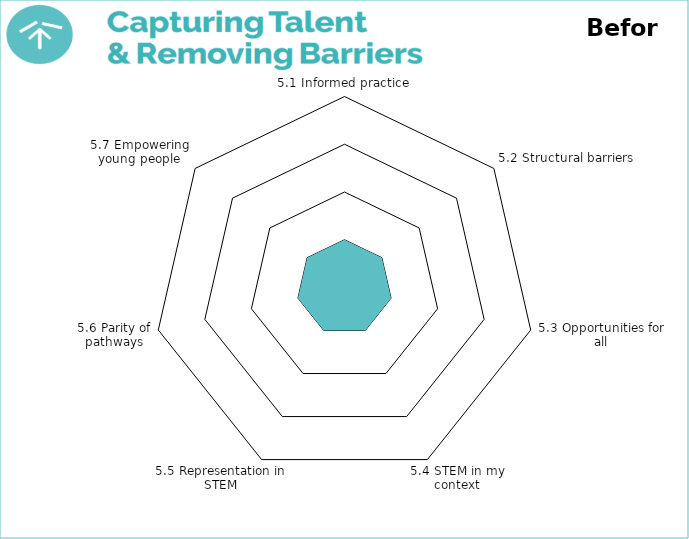
| Category | Theme 1: Leadership, Vision & Culture 

Before |
|---|---|
| 5.1 Informed practice | 1 |
| 5.2 Structural barriers | 1 |
| 5.3 Opportunities for all | 1 |
| 5.4 STEM in my context | 1 |
| 5.5 Representation in STEM | 1 |
| 5.6 Parity of pathways | 1 |
| 5.7 Empowering young people | 1 |